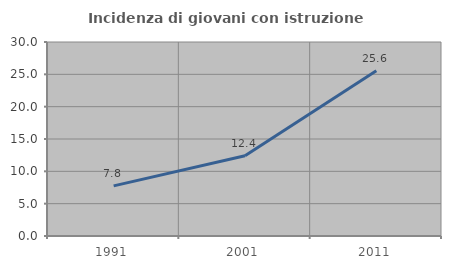
| Category | Incidenza di giovani con istruzione universitaria |
|---|---|
| 1991.0 | 7.751 |
| 2001.0 | 12.416 |
| 2011.0 | 25.562 |